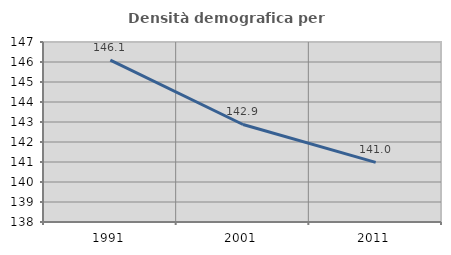
| Category | Densità demografica |
|---|---|
| 1991.0 | 146.097 |
| 2001.0 | 142.876 |
| 2011.0 | 140.981 |